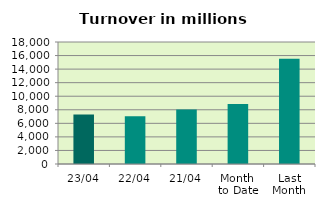
| Category | Series 0 |
|---|---|
| 23/04 | 7311.6 |
| 22/04 | 7041.746 |
| 21/04 | 8039.767 |
| Month 
to Date | 8858.343 |
| Last
Month | 15518.097 |